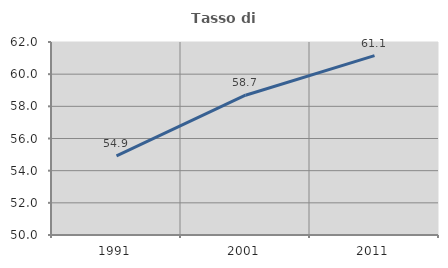
| Category | Tasso di occupazione   |
|---|---|
| 1991.0 | 54.913 |
| 2001.0 | 58.693 |
| 2011.0 | 61.149 |